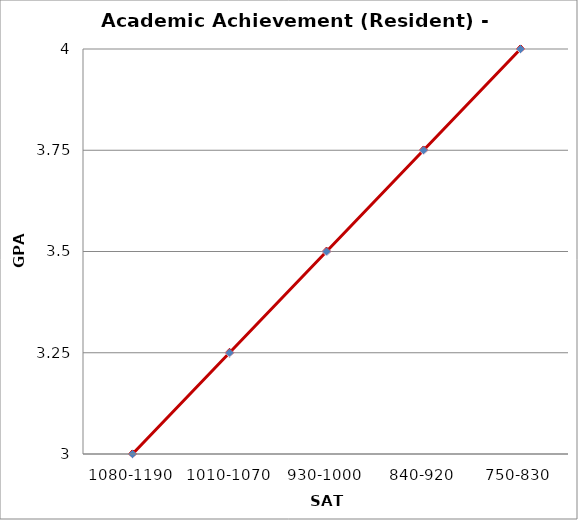
| Category | Dean's Award - $2750 |
|---|---|
| 1080-1190 | 3 |
| 1010-1070 | 3.25 |
| 930-1000 | 3.5 |
| 840-920 | 3.75 |
| 750-830 | 4 |